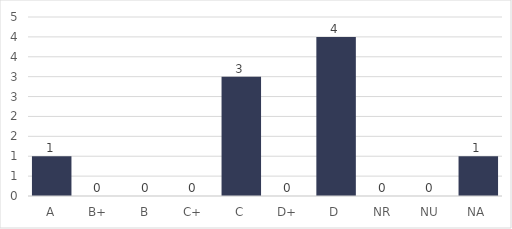
| Category | 2018 |
|---|---|
| A | 1 |
| B+ | 0 |
| B | 0 |
| C+ | 0 |
| C | 3 |
| D+ | 0 |
| D | 4 |
| NR | 0 |
| NU | 0 |
| NA | 1 |